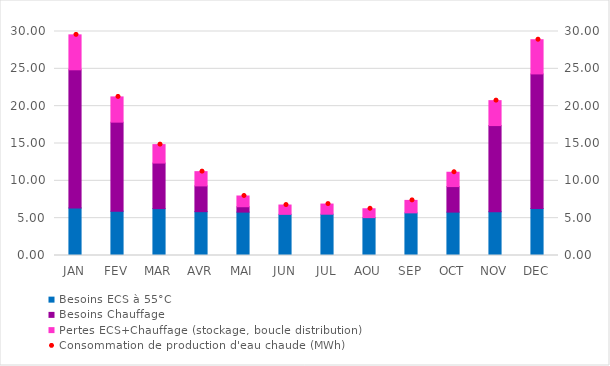
| Category | Besoins ECS à 55°C | Besoins Chauffage | Pertes ECS+Chauffage (stockage, boucle distribution) |
|---|---|---|---|
| JAN | 6.37 | 18.5 | 4.68 |
| FEV | 5.93 | 11.93 | 3.38 |
| MAR | 6.28 | 6.1 | 2.47 |
| AVR | 5.87 | 3.45 | 1.91 |
| MAI | 5.81 | 0.72 | 1.44 |
| JUN | 5.51 | 0 | 1.25 |
| JUL | 5.53 | 0 | 1.36 |
| AOU | 5.07 | 0 | 1.19 |
| SEP | 5.71 | 0 | 1.67 |
| OCT | 5.81 | 3.42 | 1.92 |
| NOV | 5.87 | 11.53 | 3.34 |
| DEC | 6.28 | 18.04 | 4.58 |